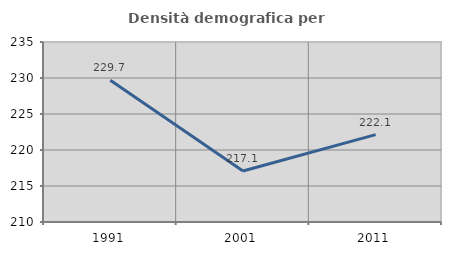
| Category | Densità demografica |
|---|---|
| 1991.0 | 229.676 |
| 2001.0 | 217.084 |
| 2011.0 | 222.131 |